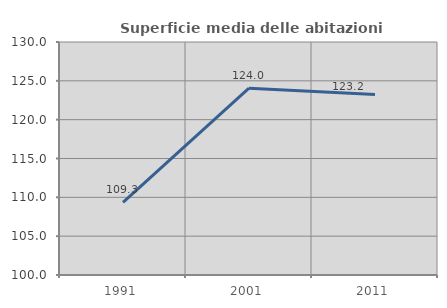
| Category | Superficie media delle abitazioni occupate |
|---|---|
| 1991.0 | 109.343 |
| 2001.0 | 124.049 |
| 2011.0 | 123.23 |